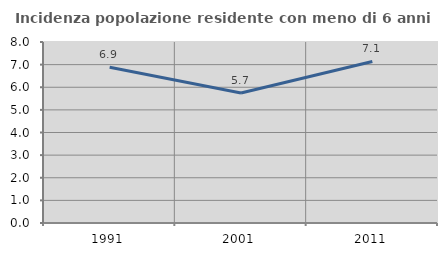
| Category | Incidenza popolazione residente con meno di 6 anni |
|---|---|
| 1991.0 | 6.887 |
| 2001.0 | 5.749 |
| 2011.0 | 7.138 |